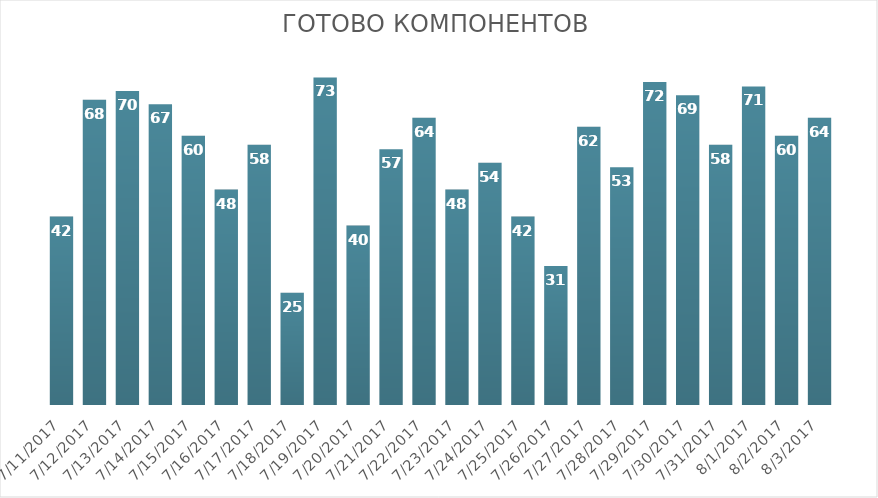
| Category | Произведено деталей |
|---|---|
| 7/11/17 | 42 |
| 7/12/17 | 68 |
| 7/13/17 | 70 |
| 7/14/17 | 67 |
| 7/15/17 | 60 |
| 7/16/17 | 48 |
| 7/17/17 | 58 |
| 7/18/17 | 25 |
| 7/19/17 | 73 |
| 7/20/17 | 40 |
| 7/21/17 | 57 |
| 7/22/17 | 64 |
| 7/23/17 | 48 |
| 7/24/17 | 54 |
| 7/25/17 | 42 |
| 7/26/17 | 31 |
| 7/27/17 | 62 |
| 7/28/17 | 53 |
| 7/29/17 | 72 |
| 7/30/17 | 69 |
| 7/31/17 | 58 |
| 8/1/17 | 71 |
| 8/2/17 | 60 |
| 8/3/17 | 64 |